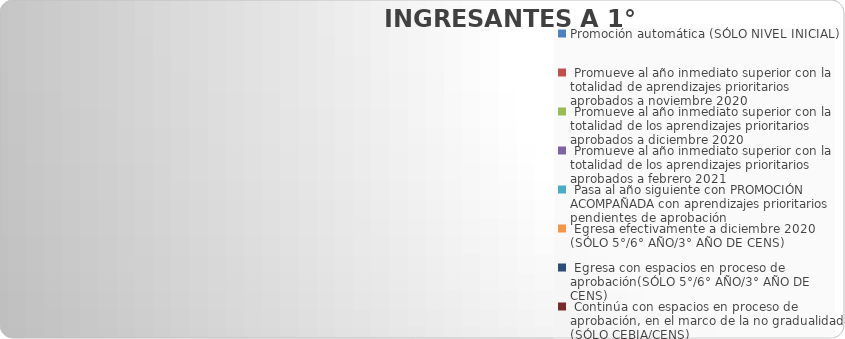
| Category | Series 0 |
|---|---|
| Promoción automática (SÓLO NIVEL INICIAL) | 0 |
|  Promueve al año inmediato superior con la totalidad de aprendizajes prioritarios aprobados a noviembre 2020 | 0 |
|  Promueve al año inmediato superior con la totalidad de los aprendizajes prioritarios aprobados a diciembre 2020 | 0 |
|  Promueve al año inmediato superior con la totalidad de los aprendizajes prioritarios aprobados a febrero 2021 | 0 |
|  Pasa al año siguiente con PROMOCIÓN ACOMPAÑADA con aprendizajes prioritarios pendientes de aprobación | 0 |
|  Egresa efectivamente a diciembre 2020 (SÓLO 5°/6° AÑO/3° AÑO DE CENS) | 0 |
|  Egresa con espacios en proceso de aprobación(SÓLO 5°/6° AÑO/3° AÑO DE CENS) | 0 |
|  Continúa con espacios en proceso de aprobación, en el marco de la no gradualidad (SÓLO CEBJA/CENS) | 0 |